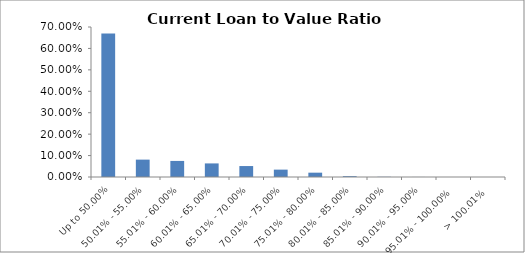
| Category | Series 0 |
|---|---|
| Up to 50.00% | 0.67 |
| 50.01% - 55.00% | 0.081 |
| 55.01% - 60.00% | 0.075 |
| 60.01% - 65.00% | 0.063 |
| 65.01% - 70.00% | 0.051 |
| 70.01% - 75.00% | 0.034 |
| 75.01% - 80.00% | 0.02 |
| 80.01% - 85.00% | 0.004 |
| 85.01% - 90.00% | 0.001 |
| 90.01% - 95.00% | 0 |
| 95.01% - 100.00% | 0 |
| > 100.01% | 0 |